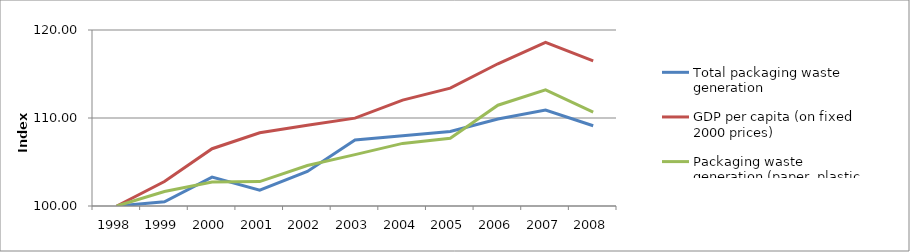
| Category | Total packaging waste generation  | GDP per capita (on fixed 2000 prices) | Packaging waste generation (paper, plastic, metals, glass) |
|---|---|---|---|
| 1998.0 | 100 | 100 | 100 |
| 1999.0 | 100.477 | 102.788 | 101.653 |
| 2000.0 | 103.278 | 106.508 | 102.732 |
| 2001.0 | 101.788 | 108.317 | 102.776 |
| 2002.0 | 103.933 | 109.178 | 104.6 |
| 2003.0 | 107.509 | 109.982 | 105.836 |
| 2004.0 | 107.986 | 112.038 | 107.114 |
| 2005.0 | 108.462 | 113.393 | 107.699 |
| 2006.0 | 109.893 | 116.16 | 111.451 |
| 2007.0 | 110.906 | 118.585 | 113.189 |
| 2008.0 | 109.118 | 116.494 | 110.679 |